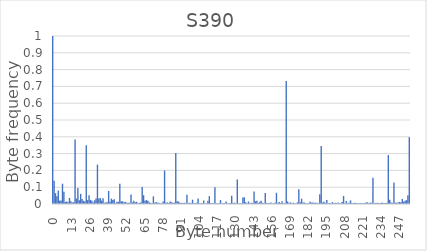
| Category | Series 0 |
|---|---|
| 0.0 | 1 |
| 1.0 | 0.138 |
| 2.0 | 0.065 |
| 3.0 | 0.046 |
| 4.0 | 0.081 |
| 5.0 | 0.02 |
| 6.0 | 0.02 |
| 7.0 | 0.121 |
| 8.0 | 0.072 |
| 9.0 | 0.012 |
| 10.0 | 0.015 |
| 11.0 | 0.011 |
| 12.0 | 0.036 |
| 13.0 | 0.017 |
| 14.0 | 0.009 |
| 15.0 | 0.011 |
| 16.0 | 0.384 |
| 17.0 | 0.033 |
| 18.0 | 0.095 |
| 19.0 | 0.023 |
| 20.0 | 0.061 |
| 21.0 | 0.03 |
| 22.0 | 0.019 |
| 23.0 | 0.015 |
| 24.0 | 0.349 |
| 25.0 | 0.023 |
| 26.0 | 0.052 |
| 27.0 | 0.024 |
| 28.0 | 0.02 |
| 29.0 | 0.009 |
| 30.0 | 0.022 |
| 31.0 | 0.033 |
| 32.0 | 0.235 |
| 33.0 | 0.033 |
| 34.0 | 0.036 |
| 35.0 | 0.02 |
| 36.0 | 0.034 |
| 37.0 | 0.007 |
| 38.0 | 0.011 |
| 39.0 | 0.011 |
| 40.0 | 0.077 |
| 41.0 | 0.013 |
| 42.0 | 0.032 |
| 43.0 | 0.024 |
| 44.0 | 0.029 |
| 45.0 | 0.006 |
| 46.0 | 0.013 |
| 47.0 | 0.013 |
| 48.0 | 0.121 |
| 49.0 | 0.016 |
| 50.0 | 0.016 |
| 51.0 | 0.011 |
| 52.0 | 0.013 |
| 53.0 | 0.007 |
| 54.0 | 0.008 |
| 55.0 | 0.007 |
| 56.0 | 0.057 |
| 57.0 | 0.009 |
| 58.0 | 0.02 |
| 59.0 | 0.011 |
| 60.0 | 0.013 |
| 61.0 | 0.005 |
| 62.0 | 0.007 |
| 63.0 | 0.008 |
| 64.0 | 0.102 |
| 65.0 | 0.052 |
| 66.0 | 0.02 |
| 67.0 | 0.023 |
| 68.0 | 0.02 |
| 69.0 | 0.01 |
| 70.0 | 0.006 |
| 71.0 | 0.006 |
| 72.0 | 0.045 |
| 73.0 | 0.007 |
| 74.0 | 0.011 |
| 75.0 | 0.007 |
| 76.0 | 0.008 |
| 77.0 | 0.004 |
| 78.0 | 0.005 |
| 79.0 | 0.016 |
| 80.0 | 0.2 |
| 81.0 | 0.008 |
| 82.0 | 0.009 |
| 83.0 | 0.007 |
| 84.0 | 0.015 |
| 85.0 | 0.01 |
| 86.0 | 0.007 |
| 87.0 | 0.007 |
| 88.0 | 0.304 |
| 89.0 | 0.017 |
| 90.0 | 0.014 |
| 91.0 | 0.008 |
| 92.0 | 0.007 |
| 93.0 | 0.005 |
| 94.0 | 0.008 |
| 95.0 | 0.005 |
| 96.0 | 0.056 |
| 97.0 | 0.006 |
| 98.0 | 0.007 |
| 99.0 | 0.005 |
| 100.0 | 0.026 |
| 101.0 | 0.004 |
| 102.0 | 0.005 |
| 103.0 | 0.007 |
| 104.0 | 0.033 |
| 105.0 | 0.004 |
| 106.0 | 0.006 |
| 107.0 | 0.004 |
| 108.0 | 0.021 |
| 109.0 | 0.003 |
| 110.0 | 0.004 |
| 111.0 | 0.02 |
| 112.0 | 0.047 |
| 113.0 | 0.006 |
| 114.0 | 0.007 |
| 115.0 | 0.005 |
| 116.0 | 0.099 |
| 117.0 | 0.004 |
| 118.0 | 0.004 |
| 119.0 | 0.005 |
| 120.0 | 0.023 |
| 121.0 | 0.004 |
| 122.0 | 0.005 |
| 123.0 | 0.004 |
| 124.0 | 0.016 |
| 125.0 | 0.003 |
| 126.0 | 0.004 |
| 127.0 | 0.006 |
| 128.0 | 0.049 |
| 129.0 | 0.005 |
| 130.0 | 0.008 |
| 131.0 | 0.005 |
| 132.0 | 0.146 |
| 133.0 | 0.004 |
| 134.0 | 0.004 |
| 135.0 | 0.004 |
| 136.0 | 0.039 |
| 137.0 | 0.041 |
| 138.0 | 0.01 |
| 139.0 | 0.004 |
| 140.0 | 0.015 |
| 141.0 | 0.005 |
| 142.0 | 0.007 |
| 143.0 | 0.006 |
| 144.0 | 0.074 |
| 145.0 | 0.016 |
| 146.0 | 0.02 |
| 147.0 | 0.005 |
| 148.0 | 0.011 |
| 149.0 | 0.02 |
| 150.0 | 0.007 |
| 151.0 | 0.004 |
| 152.0 | 0.065 |
| 153.0 | 0.007 |
| 154.0 | 0.006 |
| 155.0 | 0.004 |
| 156.0 | 0.008 |
| 157.0 | 0.003 |
| 158.0 | 0.004 |
| 159.0 | 0.008 |
| 160.0 | 0.067 |
| 161.0 | 0.007 |
| 162.0 | 0.012 |
| 163.0 | 0.006 |
| 164.0 | 0.017 |
| 165.0 | 0.004 |
| 166.0 | 0.004 |
| 167.0 | 0.733 |
| 168.0 | 0.015 |
| 169.0 | 0.004 |
| 170.0 | 0.01 |
| 171.0 | 0.005 |
| 172.0 | 0.007 |
| 173.0 | 0.003 |
| 174.0 | 0.004 |
| 175.0 | 0.01 |
| 176.0 | 0.088 |
| 177.0 | 0.011 |
| 178.0 | 0.032 |
| 179.0 | 0.01 |
| 180.0 | 0.008 |
| 181.0 | 0.005 |
| 182.0 | 0.005 |
| 183.0 | 0.004 |
| 184.0 | 0.014 |
| 185.0 | 0.008 |
| 186.0 | 0.009 |
| 187.0 | 0.007 |
| 188.0 | 0.007 |
| 189.0 | 0.007 |
| 190.0 | 0.004 |
| 191.0 | 0.057 |
| 192.0 | 0.345 |
| 193.0 | 0.009 |
| 194.0 | 0.014 |
| 195.0 | 0.006 |
| 196.0 | 0.024 |
| 197.0 | 0.005 |
| 198.0 | 0.005 |
| 199.0 | 0.004 |
| 200.0 | 0.011 |
| 201.0 | 0.004 |
| 202.0 | 0.008 |
| 203.0 | 0.005 |
| 204.0 | 0.008 |
| 205.0 | 0.004 |
| 206.0 | 0.005 |
| 207.0 | 0.012 |
| 208.0 | 0.048 |
| 209.0 | 0.005 |
| 210.0 | 0.018 |
| 211.0 | 0.004 |
| 212.0 | 0.007 |
| 213.0 | 0.021 |
| 214.0 | 0.004 |
| 215.0 | 0.005 |
| 216.0 | 0.008 |
| 217.0 | 0.005 |
| 218.0 | 0.005 |
| 219.0 | 0.004 |
| 220.0 | 0.006 |
| 221.0 | 0.004 |
| 222.0 | 0.005 |
| 223.0 | 0.005 |
| 224.0 | 0.009 |
| 225.0 | 0.01 |
| 226.0 | 0.005 |
| 227.0 | 0.008 |
| 228.0 | 0.007 |
| 229.0 | 0.156 |
| 230.0 | 0.005 |
| 231.0 | 0.005 |
| 232.0 | 0.008 |
| 233.0 | 0.005 |
| 234.0 | 0.006 |
| 235.0 | 0.007 |
| 236.0 | 0.007 |
| 237.0 | 0.006 |
| 238.0 | 0.006 |
| 239.0 | 0.008 |
| 240.0 | 0.291 |
| 241.0 | 0.026 |
| 242.0 | 0.008 |
| 243.0 | 0.007 |
| 244.0 | 0.127 |
| 245.0 | 0.008 |
| 246.0 | 0.008 |
| 247.0 | 0.008 |
| 248.0 | 0.012 |
| 249.0 | 0.011 |
| 250.0 | 0.03 |
| 251.0 | 0.013 |
| 252.0 | 0.019 |
| 253.0 | 0.023 |
| 254.0 | 0.052 |
| 255.0 | 0.397 |